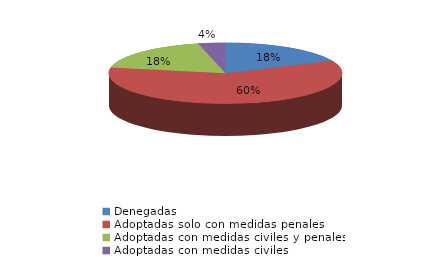
| Category | Series 0 |
|---|---|
| Denegadas | 39 |
| Adoptadas solo con medidas penales | 128 |
| Adoptadas con medidas civiles y penales | 39 |
| Adoptadas con medidas civiles | 8 |